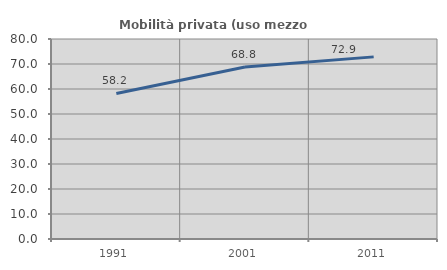
| Category | Mobilità privata (uso mezzo privato) |
|---|---|
| 1991.0 | 58.214 |
| 2001.0 | 68.802 |
| 2011.0 | 72.852 |